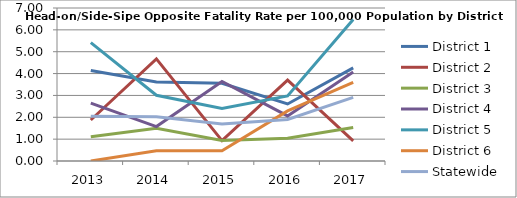
| Category | District 1 | District 2 | District 3 | District 4 | District 5 | District 6 | Statewide |
|---|---|---|---|---|---|---|---|
| 2013.0 | 4.137 | 1.876 | 1.107 | 2.647 | 5.417 | 0 | 2.047 |
| 2014.0 | 3.613 | 4.671 | 1.492 | 1.575 | 3.008 | 0.471 | 2.019 |
| 2015.0 | 3.555 | 0.931 | 0.934 | 3.638 | 2.403 | 0.467 | 1.692 |
| 2016.0 | 2.608 | 3.701 | 1.046 | 2.062 | 2.98 | 2.291 | 1.901 |
| 2017.0 | 4.258 | 0.921 | 1.529 | 4.067 | 6.476 | 3.601 | 2.912 |